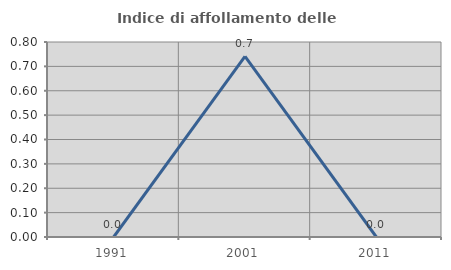
| Category | Indice di affollamento delle abitazioni  |
|---|---|
| 1991.0 | 0 |
| 2001.0 | 0.741 |
| 2011.0 | 0 |